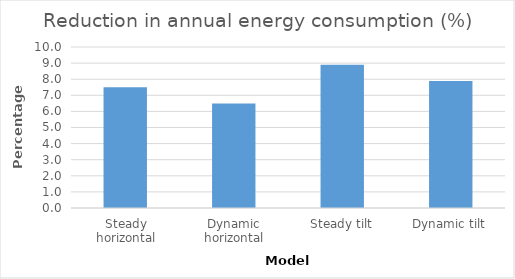
| Category | Series 0 |
|---|---|
| Steady horizontal | 7.503 |
| Dynamic horizontal | 6.498 |
| Steady tilt | 8.891 |
| Dynamic tilt | 7.896 |